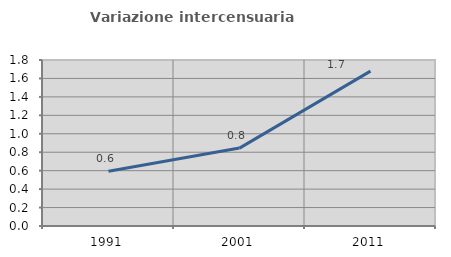
| Category | Variazione intercensuaria annua |
|---|---|
| 1991.0 | 0.593 |
| 2001.0 | 0.845 |
| 2011.0 | 1.679 |